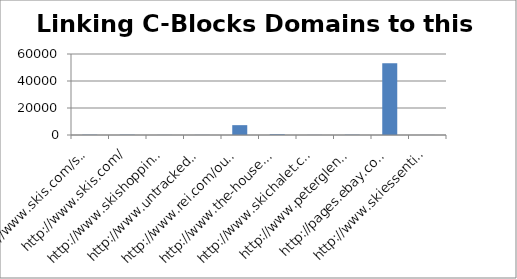
| Category | Linking C-Blocks Domains to this domain |
|---|---|
| http://www.skis.com/ski-equipment/c9/ | 202 |
| http://www.skis.com/ | 202 |
| http://www.skishoppingguide.com/ | 80 |
| http://www.untracked.com/ | 98 |
| http://www.rei.com/outlet/category/22000078 | 7291 |
| http://www.the-house.com/skis.html | 509 |
| http://www.skichalet.com/ | 83 |
| http://www.peterglenn.com/ | 193 |
| http://pages.ebay.com/buy/guides/skis-skiing-equipment-buying-guide/ | 53178 |
| http://www.skiessentials.com/ | 70 |